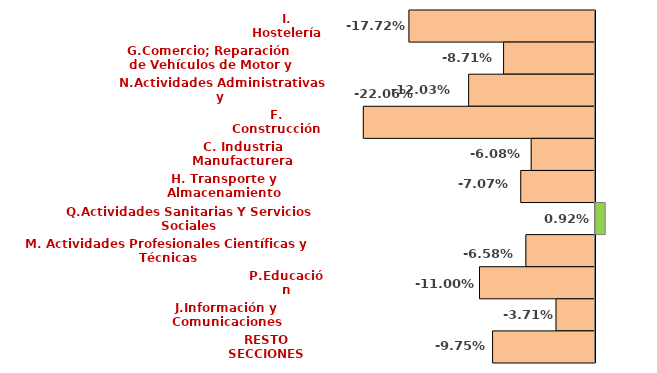
| Category | Series 0 |
|---|---|
| I. Hostelería | -0.177 |
| G.Comercio; Reparación 
de Vehículos de Motor y Motocicletas | -0.087 |
| N.Actividades Administrativas y 
Servicios Auxiliares | -0.12 |
| F. Construcción | -0.221 |
| C. Industria Manufacturera | -0.061 |
| H. Transporte y Almacenamiento | -0.071 |
| Q.Actividades Sanitarias Y Servicios Sociales | 0.009 |
| M. Actividades Profesionales Científicas y  Técnicas | -0.066 |
| P.Educación | -0.11 |
| J.Información y Comunicaciones | -0.037 |
| RESTO SECCIONES | -0.098 |